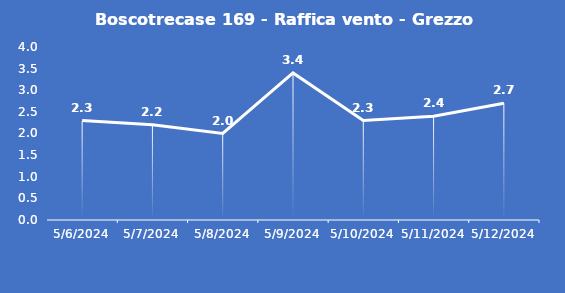
| Category | Boscotrecase 169 - Raffica vento - Grezzo (m/s) |
|---|---|
| 5/6/24 | 2.3 |
| 5/7/24 | 2.2 |
| 5/8/24 | 2 |
| 5/9/24 | 3.4 |
| 5/10/24 | 2.3 |
| 5/11/24 | 2.4 |
| 5/12/24 | 2.7 |